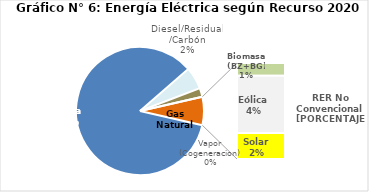
| Category | Series 0 |
|---|---|
| Agua | 2824.08 |
| Gas Natural | 185.918 |
| Diesel/Residual/Carbón | 73.434 |
| Vapor (Cogeneracion) | 0.275 |
| Biomasa (BZ+BG) | 31.953 |
| Eólica | 142.075 |
| Solar | 64.591 |